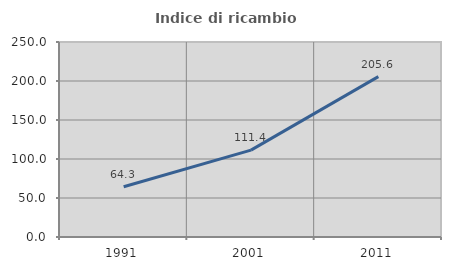
| Category | Indice di ricambio occupazionale  |
|---|---|
| 1991.0 | 64.338 |
| 2001.0 | 111.399 |
| 2011.0 | 205.634 |